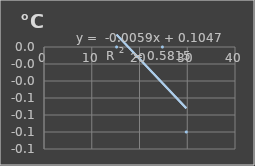
| Category | Temperatura |
|---|---|
| 15.2 | 0 |
| 24.8 | 0 |
| 29.8 | -0.1 |